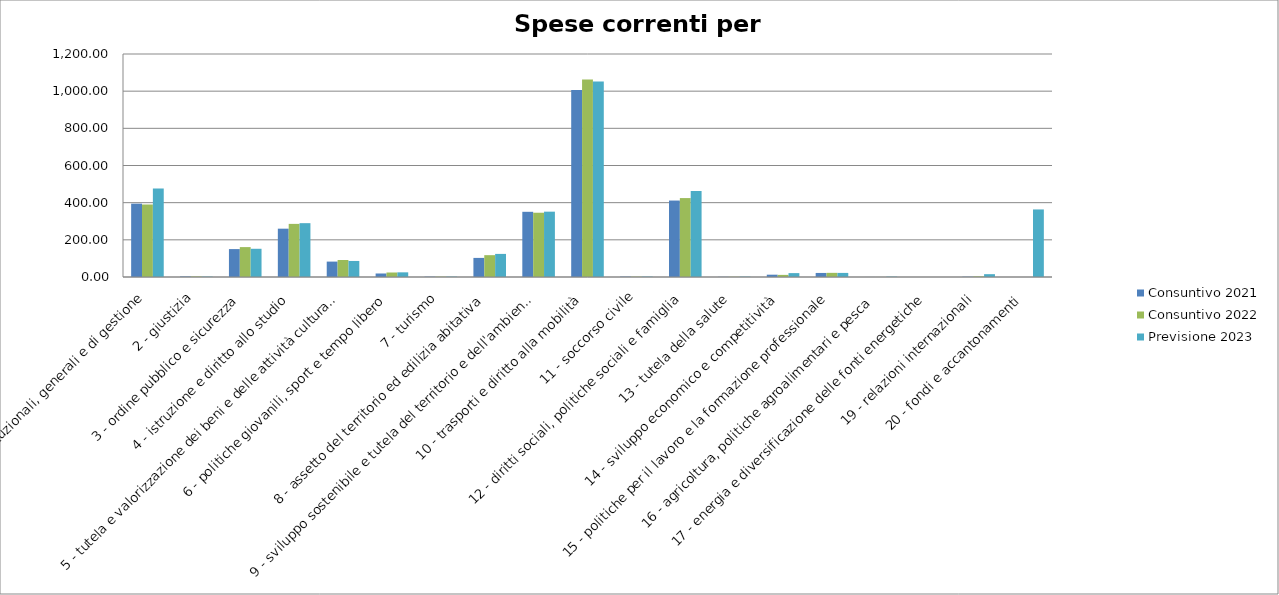
| Category |  Consuntivo 2021  |  Consuntivo 2022  |  Previsione 2023  |
|---|---|---|---|
| 1 - servizi istituzionali, generali e di gestione | 394.68 | 390.09 | 475.74 |
| 2 - giustizia | 2.77 | 2.75 | 2.08 |
| 3 - ordine pubblico e sicurezza | 150.2 | 160.89 | 151.86 |
| 4 - istruzione e diritto allo studio | 260.03 | 285.85 | 289.7 |
| 5 - tutela e valorizzazione dei beni e delle attività culturali | 82.88 | 91.38 | 86.35 |
| 6 - politiche giovanili, sport e tempo libero | 18.89 | 24.22 | 25.07 |
| 7 - turismo | 1.75 | 1.75 | 2 |
| 8 - assetto del territorio ed edilizia abitativa | 102.73 | 117.52 | 124.27 |
| 9 - sviluppo sostenibile e tutela del territorio e dell'ambiente | 350.85 | 345.85 | 351.59 |
| 10 - trasporti e diritto alla mobilità | 1006.56 | 1062.54 | 1052.4 |
| 11 - soccorso civile | 1.96 | 1.63 | 2.1 |
| 12 - diritti sociali, politiche sociali e famiglia | 411.4 | 424.7 | 463.3 |
| 13 - tutela della salute | 0.99 | 1.21 | 1.86 |
| 14 - sviluppo economico e competitività | 12.42 | 11.34 | 20.95 |
| 15 - politiche per il lavoro e la formazione professionale | 21.76 | 22.33 | 22 |
| 16 - agricoltura, politiche agroalimentari e pesca | 0.18 | 0.17 | 2.01 |
| 17 - energia e diversificazione delle fonti energetiche | 0 | 0 | 0.04 |
| 19 - relazioni internazionali | 1.56 | 3.1 | 15.23 |
| 20 - fondi e accantonamenti | 0 | 0 | 363.51 |